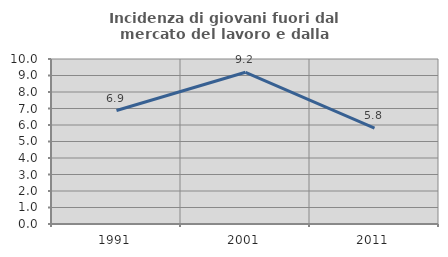
| Category | Incidenza di giovani fuori dal mercato del lavoro e dalla formazione  |
|---|---|
| 1991.0 | 6.878 |
| 2001.0 | 9.195 |
| 2011.0 | 5.806 |